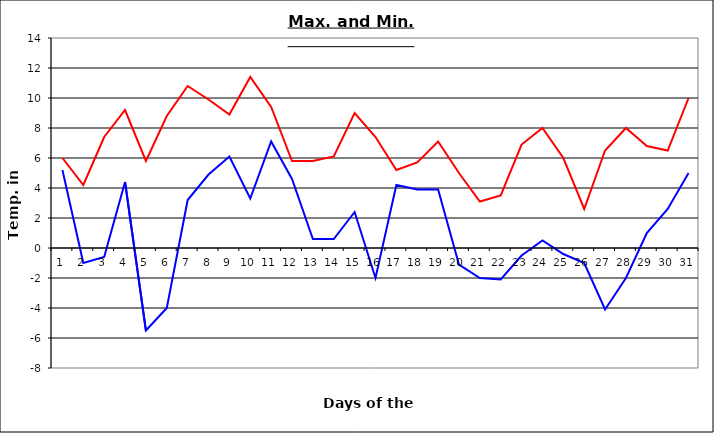
| Category | Series 0 | Series 1 |
|---|---|---|
| 0 | 6 | 5.2 |
| 1 | 4.2 | -1 |
| 2 | 7.4 | -0.6 |
| 3 | 9.2 | 4.4 |
| 4 | 5.8 | -5.5 |
| 5 | 8.8 | -4 |
| 6 | 10.8 | 3.2 |
| 7 | 9.9 | 4.9 |
| 8 | 8.9 | 6.1 |
| 9 | 11.4 | 3.3 |
| 10 | 9.4 | 7.1 |
| 11 | 5.8 | 4.6 |
| 12 | 5.8 | 0.6 |
| 13 | 6.1 | 0.6 |
| 14 | 9 | 2.4 |
| 15 | 7.4 | -2 |
| 16 | 5.2 | 4.2 |
| 17 | 5.7 | 3.9 |
| 18 | 7.1 | 3.9 |
| 19 | 5 | -1.1 |
| 20 | 3.1 | -2 |
| 21 | 3.5 | -2.1 |
| 22 | 6.9 | -0.5 |
| 23 | 8 | 0.5 |
| 24 | 6 | -0.4 |
| 25 | 2.6 | -1 |
| 26 | 6.5 | -4.1 |
| 27 | 8 | -2 |
| 28 | 6.8 | 1 |
| 29 | 6.5 | 2.6 |
| 30 | 10 | 5 |